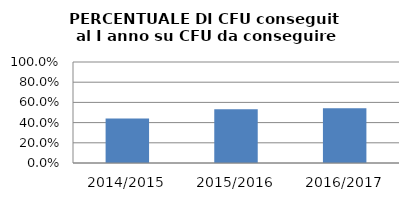
| Category | 2014/2015 2015/2016 2016/2017 |
|---|---|
| 2014/2015 | 0.442 |
| 2015/2016 | 0.533 |
| 2016/2017 | 0.541 |